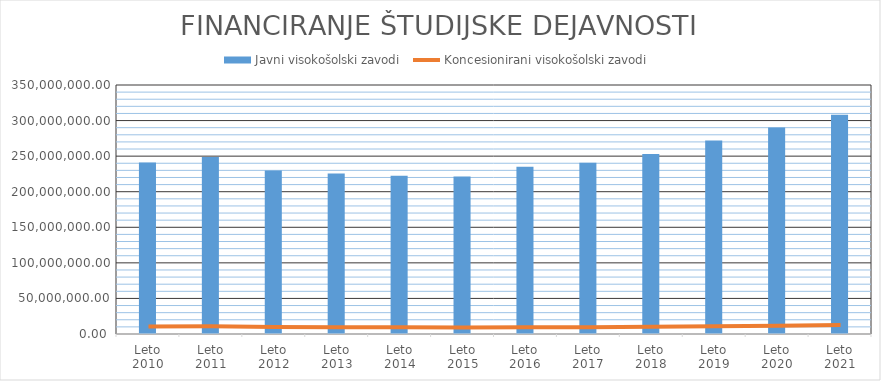
| Category | Javni visokošolski zavodi |
|---|---|
| Leto 2010 | 241007214.61 |
| Leto 2011 | 248795700.28 |
| Leto 2012 | 229958439.05 |
| Leto 2013 | 225587406.19 |
| Leto 2014 | 222517242.56 |
| Leto 2015 | 221382972.87 |
| Leto 2016 | 235055654.86 |
| Leto 2017 | 240850319.02 |
| Leto 2018 | 252860248.16 |
| Leto 2019 | 272009610.16 |
| Leto 2020 | 290214615.05 |
| Leto 2021 | 308279112.47 |